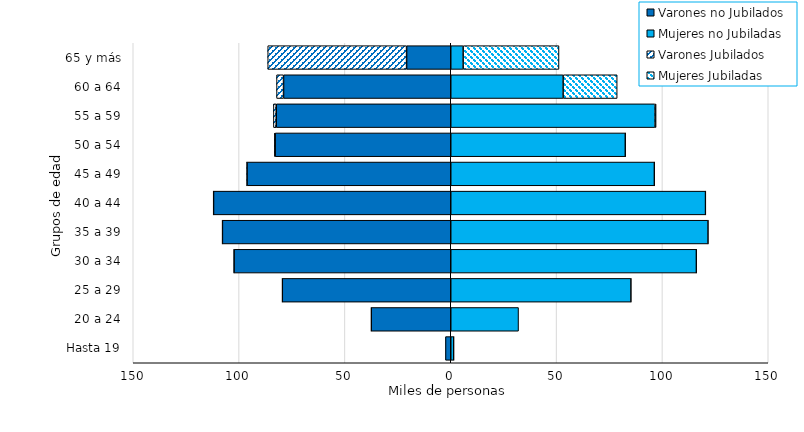
| Category | Varones no Jubilados | Mujeres no Jubiladas | Varones Jubilados | Mujeres Jubiladas |
|---|---|---|---|---|
| Hasta 19 | -2486 | 1443 | 0 | 1 |
| 20 a 24 | -37572 | 32025 | -1 | 0 |
| 25 a 29 | -79585 | 85185 | -9 | 1 |
| 30 a 34 | -102408 | 116073 | -19 | 8 |
| 35 a 39 | -107882 | 121599 | -51 | 14 |
| 40 a 44 | -112072 | 120380 | -76 | 33 |
| 45 a 49 | -96255 | 96214 | -147 | 75 |
| 50 a 54 | -82989 | 82471 | -289 | 152 |
| 55 a 59 | -82454 | 96529 | -1327 | 498 |
| 60 a 64 | -78994 | 53096 | -3305 | 25531 |
| 65 y más | -20865 | 5861 | -65608 | 45284 |